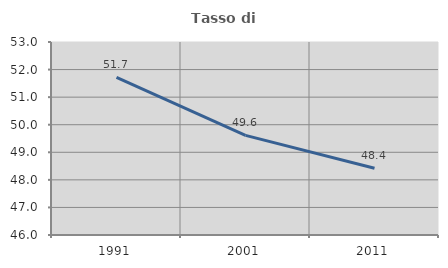
| Category | Tasso di occupazione   |
|---|---|
| 1991.0 | 51.716 |
| 2001.0 | 49.612 |
| 2011.0 | 48.419 |